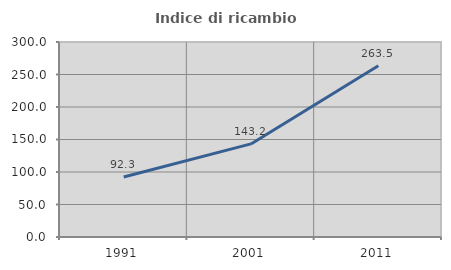
| Category | Indice di ricambio occupazionale  |
|---|---|
| 1991.0 | 92.308 |
| 2001.0 | 143.195 |
| 2011.0 | 263.514 |